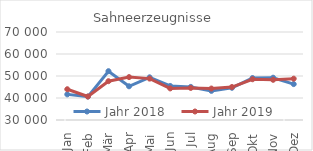
| Category | Jahr 2018 | Jahr 2019 |
|---|---|---|
| Jan | 41648.699 | 43982.524 |
| Feb | 40643.408 | 40677.941 |
| Mär | 52187.38 | 47640.18 |
| Apr | 45321.395 | 49499.734 |
| Mai | 49400.053 | 48815.684 |
| Jun | 45466.595 | 44357.051 |
| Jul | 45044.028 | 44583.068 |
| Aug | 43246.599 | 44292.561 |
| Sep | 44639.042 | 44986.225 |
| Okt | 49072.898 | 48518.063 |
| Nov | 49218.662 | 48267.565 |
| Dez | 46316.955 | 48781.008 |